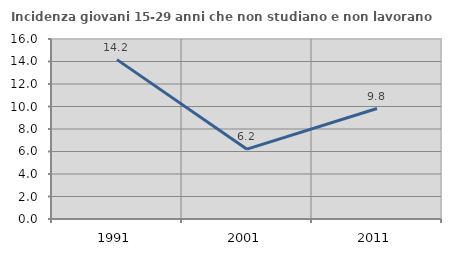
| Category | Incidenza giovani 15-29 anni che non studiano e non lavorano  |
|---|---|
| 1991.0 | 14.167 |
| 2001.0 | 6.207 |
| 2011.0 | 9.821 |